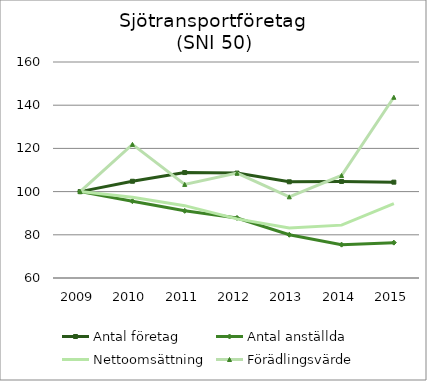
| Category | Antal företag | Antal anställda | Nettoomsättning | Förädlingsvärde |
|---|---|---|---|---|
| 2009.0 | 100 | 100 | 100 | 100 |
| 2010.0 | 104.786 | 95.559 | 97.397 | 121.863 |
| 2011.0 | 108.816 | 91.111 | 93.493 | 103.321 |
| 2012.0 | 108.564 | 87.8 | 87.38 | 108.577 |
| 2013.0 | 104.534 | 80.026 | 83.132 | 97.586 |
| 2014.0 | 104.702 | 75.439 | 84.475 | 107.447 |
| 2015.0 | 104.366 | 76.373 | 94.438 | 143.671 |